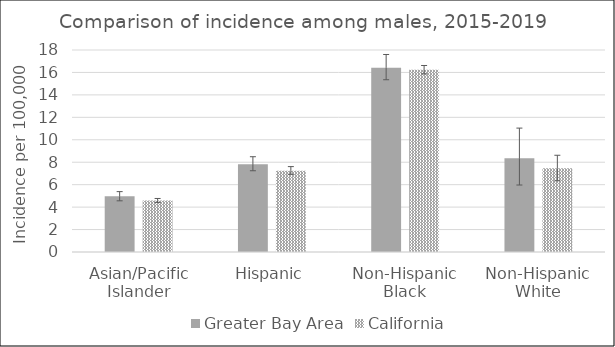
| Category | Greater Bay Area | California | SEER 18 |
|---|---|---|---|
| Asian/Pacific Islander | 4.96 | 4.59 |  |
| Hispanic | 7.83 | 7.25 |  |
| Non-Hispanic Black | 16.42 | 16.24 |  |
| Non-Hispanic White | 8.36 | 7.46 |  |